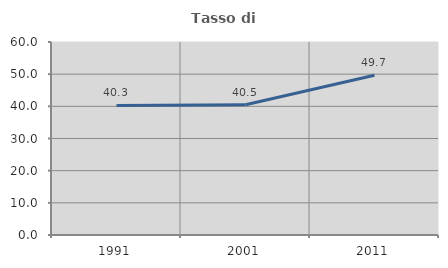
| Category | Tasso di occupazione   |
|---|---|
| 1991.0 | 40.263 |
| 2001.0 | 40.471 |
| 2011.0 | 49.684 |